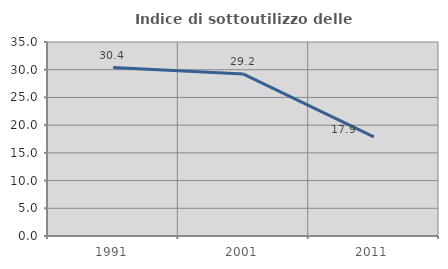
| Category | Indice di sottoutilizzo delle abitazioni  |
|---|---|
| 1991.0 | 30.387 |
| 2001.0 | 29.213 |
| 2011.0 | 17.901 |